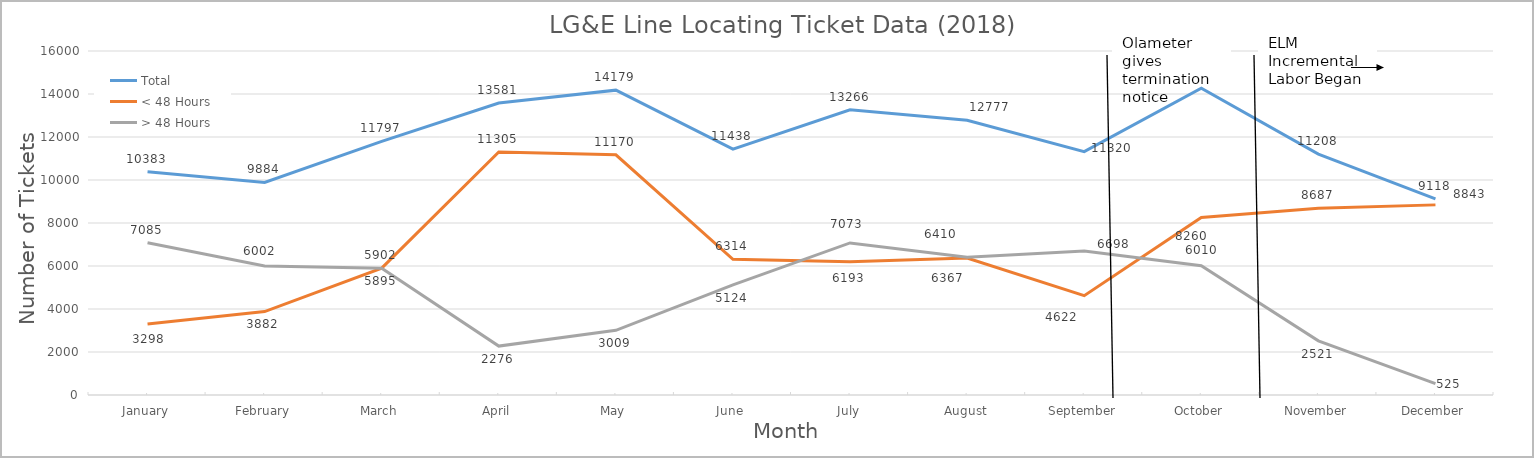
| Category | Total | < 48 Hours | > 48 Hours |
|---|---|---|---|
| January | 10383 | 3298 | 7085 |
| February | 9884 | 3882 | 6002 |
| March | 11797 | 5902 | 5895 |
| April | 13581 | 11305 | 2276 |
| May | 14179 | 11170 | 3009 |
| June | 11438 | 6314 | 5124 |
| July | 13266 | 6193 | 7073 |
| August | 12777 | 6367 | 6410 |
| September | 11320 | 4622 | 6698 |
| October | 14270 | 8260 | 6010 |
| November | 11208 | 8687 | 2521 |
| December | 9118 | 8843 | 525 |